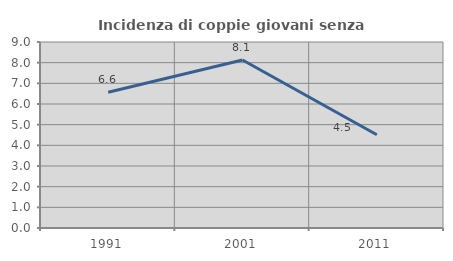
| Category | Incidenza di coppie giovani senza figli |
|---|---|
| 1991.0 | 6.569 |
| 2001.0 | 8.13 |
| 2011.0 | 4.514 |